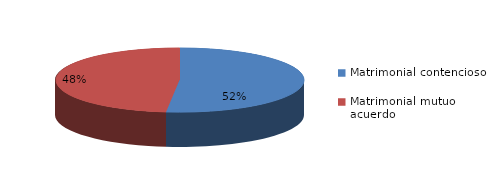
| Category | Series 0 |
|---|---|
| 0 | 390 |
| 1 | 364 |